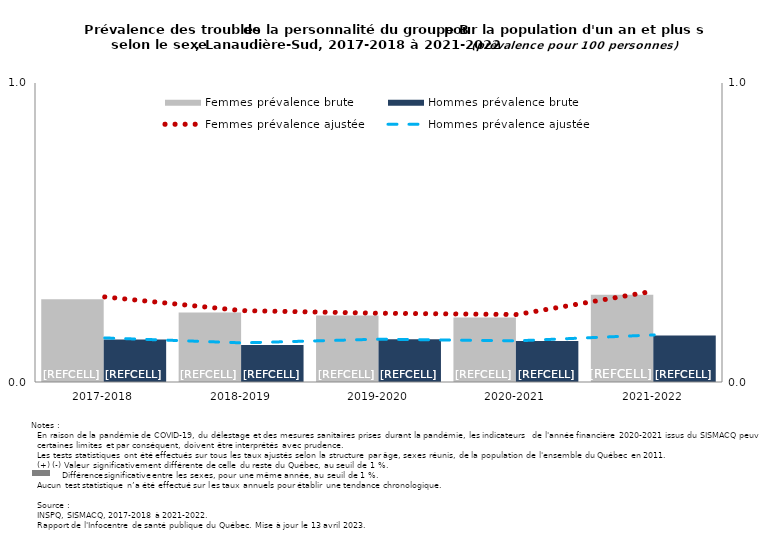
| Category | Femmes prévalence brute | Hommes prévalence brute |
|---|---|---|
| 2017-2018 | 0.276 | 0.142 |
| 2018-2019 | 0.233 | 0.123 |
| 2019-2020 | 0.223 | 0.143 |
| 2020-2021 | 0.216 | 0.137 |
| 2021-2022 | 0.292 | 0.156 |